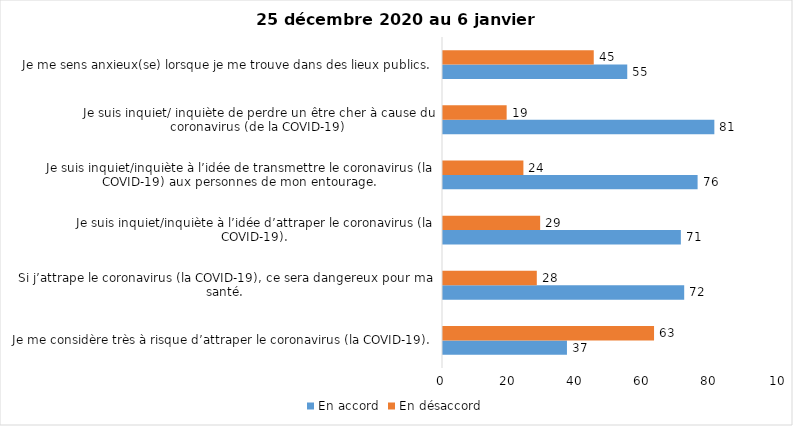
| Category | En accord | En désaccord |
|---|---|---|
| Je me considère très à risque d’attraper le coronavirus (la COVID-19). | 37 | 63 |
| Si j’attrape le coronavirus (la COVID-19), ce sera dangereux pour ma santé. | 72 | 28 |
| Je suis inquiet/inquiète à l’idée d’attraper le coronavirus (la COVID-19). | 71 | 29 |
| Je suis inquiet/inquiète à l’idée de transmettre le coronavirus (la COVID-19) aux personnes de mon entourage. | 76 | 24 |
| Je suis inquiet/ inquiète de perdre un être cher à cause du coronavirus (de la COVID-19) | 81 | 19 |
| Je me sens anxieux(se) lorsque je me trouve dans des lieux publics. | 55 | 45 |